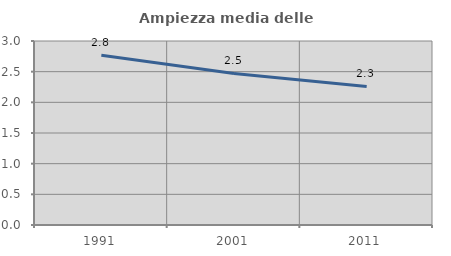
| Category | Ampiezza media delle famiglie |
|---|---|
| 1991.0 | 2.766 |
| 2001.0 | 2.471 |
| 2011.0 | 2.26 |